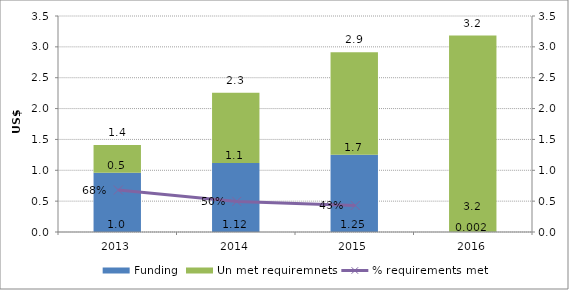
| Category | Funding | Un met requiremnets |
|---|---|---|
| 2013.0 | 0.959 | 0.451 |
| 2014.0 | 1.119 | 1.137 |
| 2015.0 | 1.252 | 1.66 |
| 2016.0 | 0.002 | 3.182 |